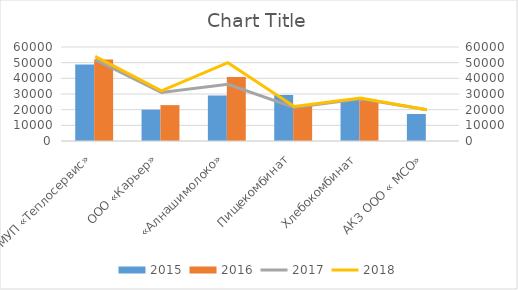
| Category | 2015 | 2016 |
|---|---|---|
| МУП «Теплосервис» | 48821 | 52000 |
| ООО «Карьер» | 20000 | 22900 |
| «Алнашимолоко» | 29044 | 40926 |
| Пищекомбинат | 29346 | 22500 |
| Хлебокомбинат | 26208 | 26000 |
| АКЗ ООО « МСО» | 17255 | 0 |